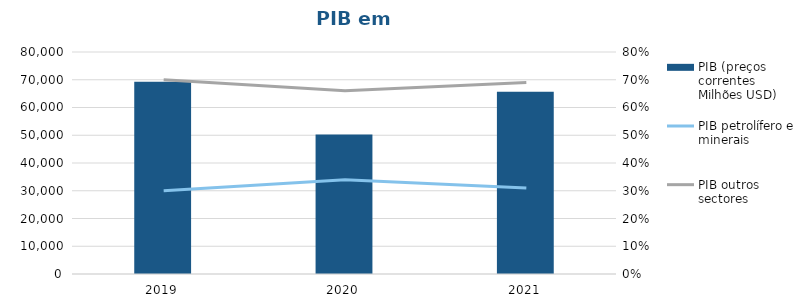
| Category | PIB (preços correntes Milhões USD) |
|---|---|
| 2019.0 | 69309 |
| 2020.0 | 50241 |
| 2021.0 | 65685 |